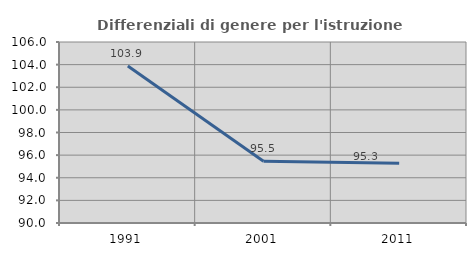
| Category | Differenziali di genere per l'istruzione superiore |
|---|---|
| 1991.0 | 103.873 |
| 2001.0 | 95.458 |
| 2011.0 | 95.288 |